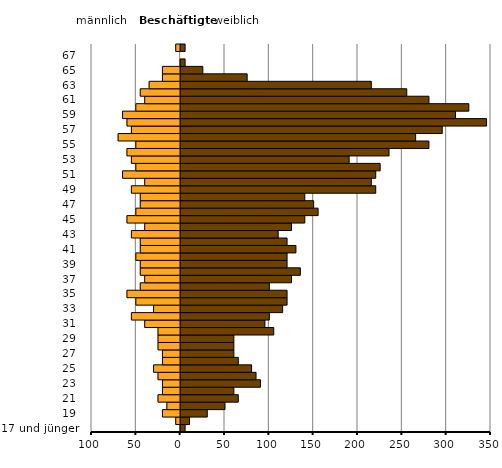
| Category | Männer | Frauen |
|---|---|---|
| 17 und jünger  | 0 | 5 |
| 18  | -5 | 10 |
| 19  | -20 | 30 |
| 20  | -15 | 50 |
| 21  | -25 | 65 |
| 22  | -20 | 60 |
| 23  | -20 | 90 |
| 24  | -25 | 85 |
| 25  | -30 | 80 |
| 26  | -20 | 65 |
| 27  | -20 | 60 |
| 28  | -25 | 60 |
| 29  | -25 | 60 |
| 30  | -25 | 105 |
| 31  | -40 | 95 |
| 32  | -55 | 100 |
| 33  | -30 | 115 |
| 34  | -50 | 120 |
| 35  | -60 | 120 |
| 36  | -45 | 100 |
| 37  | -40 | 125 |
| 38  | -45 | 135 |
| 39  | -45 | 120 |
| 40  | -50 | 120 |
| 41  | -45 | 130 |
| 42  | -45 | 120 |
| 43  | -55 | 110 |
| 44  | -40 | 125 |
| 45  | -60 | 140 |
| 46  | -50 | 155 |
| 47  | -45 | 150 |
| 48  | -45 | 140 |
| 49  | -55 | 220 |
| 50  | -40 | 215 |
| 51  | -65 | 220 |
| 52  | -50 | 225 |
| 53  | -55 | 190 |
| 54  | -60 | 235 |
| 55  | -50 | 280 |
| 56  | -70 | 265 |
| 57  | -55 | 295 |
| 58  | -60 | 345 |
| 59  | -65 | 310 |
| 60  | -50 | 325 |
| 61  | -40 | 280 |
| 62  | -45 | 255 |
| 63  | -35 | 215 |
| 64  | -20 | 75 |
| 65  | -20 | 25 |
| 66  | 0 | 5 |
| 67  | 0 | 0 |
| 68 und älter  | -5 | 5 |